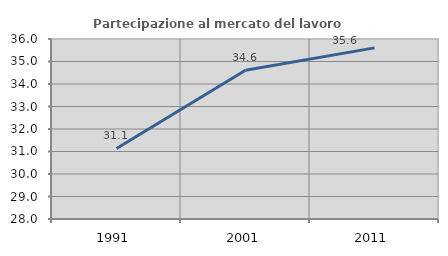
| Category | Partecipazione al mercato del lavoro  femminile |
|---|---|
| 1991.0 | 31.135 |
| 2001.0 | 34.612 |
| 2011.0 | 35.606 |